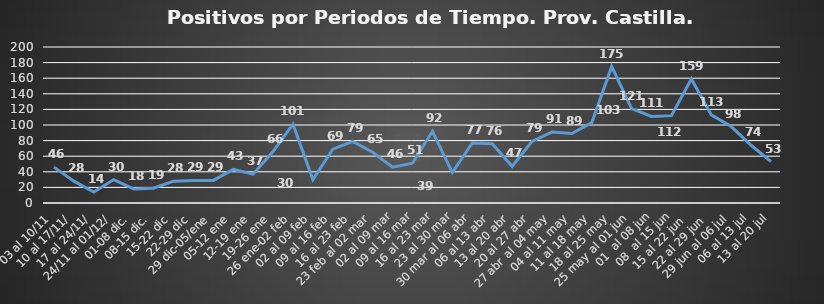
| Category | Prov. Castilla |
|---|---|
| 03 al 10/11 | 46 |
| 10 al 17/11/ | 28 |
|  17 al 24/11/ | 14 |
|  24/11 al 01/12/ | 30 |
| 01-08 dic. | 18 |
| 08-15 dic. | 19 |
| 15-22 dic | 28 |
| 22-29 dic | 29 |
| 29 dic-05/ene | 29 |
| 05-12 ene | 43 |
| 12-19 ene | 37 |
| 19-26 ene | 66 |
| 26 ene-02 feb | 101 |
| 02 al 09 feb | 30 |
| 09 al 16 feb | 69 |
| 16 al 23 feb | 79 |
| 23 feb al 02 mar | 65 |
|  02 al 09 mar | 46 |
|  09 al 16 mar | 51 |
|  16 al 23 mar | 92 |
|  23 al 30 mar | 39 |
|  30 mar al 06 abr | 77 |
| 06 al 13 abr | 76 |
| 13 al 20 abr | 47 |
| 20 al 27 abr | 79 |
| 27 abr al 04 may | 91 |
|  04 al 11 may | 89 |
|  11 al 18 may | 103 |
|  18 al 25 may | 175 |
|  25 may al 01 jun | 121 |
|  01  al 08 jun | 111 |
|  08  al 15 jun | 112 |
|  15 al 22 jun  | 159 |
|  22 al 29 jun  | 113 |
|   29 jun al 06 jul  | 98 |
|    06 al 13 jul  | 74 |
|    13 al 20 jul  | 53 |